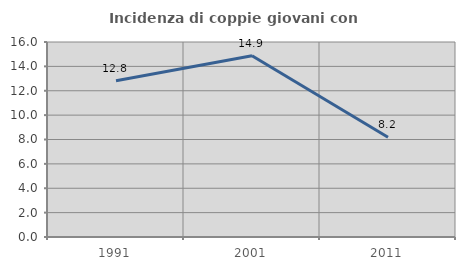
| Category | Incidenza di coppie giovani con figli |
|---|---|
| 1991.0 | 12.821 |
| 2001.0 | 14.876 |
| 2011.0 | 8.182 |